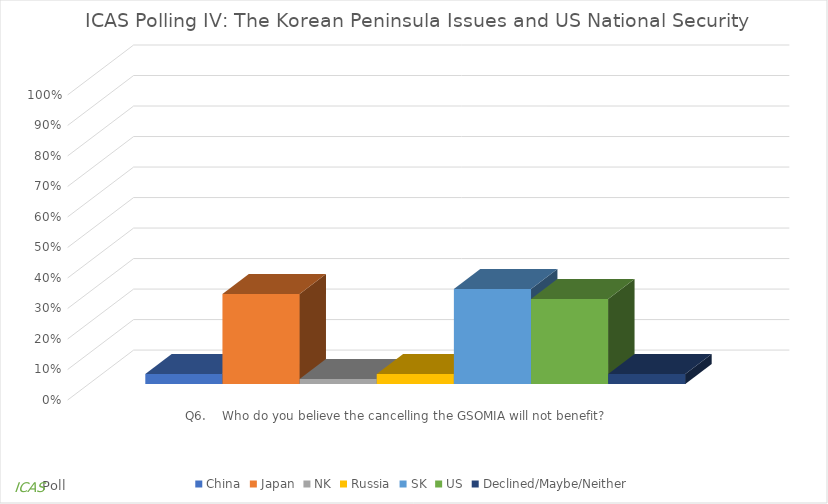
| Category | China | Japan | NK | Russia | SK | US | Declined/Maybe/Neither |
|---|---|---|---|---|---|---|---|
| Q6.    Who do you believe the cancelling the GSOMIA will not benefit? | 0.033 | 0.295 | 0.016 | 0.033 | 0.311 | 0.279 | 0.033 |